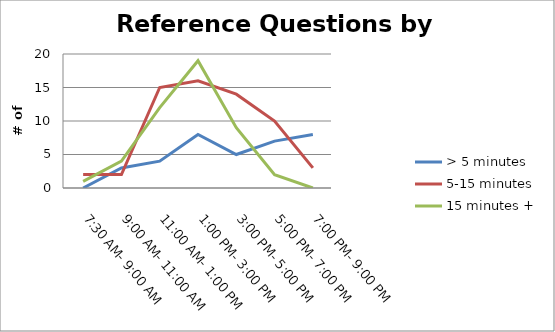
| Category | > 5 minutes | 5-15 minutes | 15 minutes + |
|---|---|---|---|
| 7:30 AM- 9:00 AM | 0 | 2 | 1 |
| 9:00 AM- 11:00 AM | 3 | 2 | 4 |
| 11:00 AM- 1:00 PM | 4 | 15 | 12 |
| 1:00 PM- 3:00 PM | 8 | 16 | 19 |
| 3:00 PM- 5:00 PM | 5 | 14 | 9 |
| 5:00 PM- 7:00 PM | 7 | 10 | 2 |
| 7:00 PM- 9:00 PM | 8 | 3 | 0 |